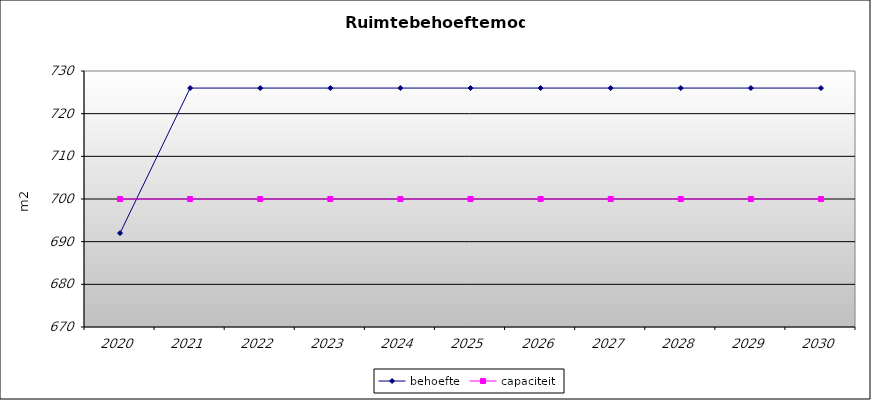
| Category | behoefte | capaciteit |
|---|---|---|
| 2020.0 | 692 | 700 |
| 2021.0 | 726 | 700 |
| 2022.0 | 726 | 700 |
| 2023.0 | 726 | 700 |
| 2024.0 | 726 | 700 |
| 2025.0 | 726 | 700 |
| 2026.0 | 726 | 700 |
| 2027.0 | 726 | 700 |
| 2028.0 | 726 | 700 |
| 2029.0 | 726 | 700 |
| 2030.0 | 726 | 700 |